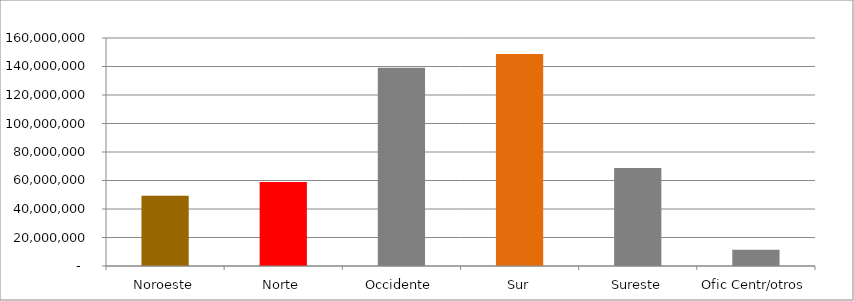
| Category | Series 0 |
|---|---|
| Noroeste | 49341337.144 |
| Norte | 58940536.189 |
| Occidente | 139115253.567 |
| Sur | 148856966.43 |
| Sureste | 68709860.212 |
| Ofic Centr/otros | 11340302.996 |